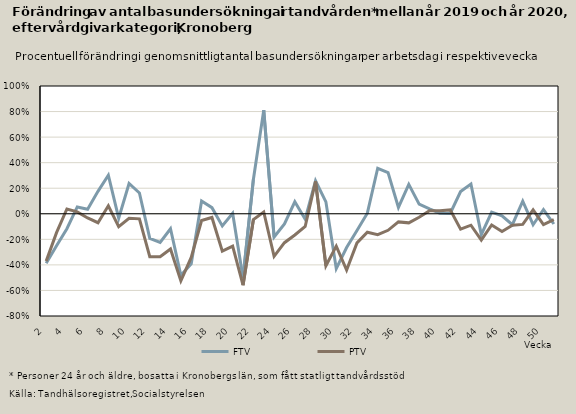
| Category | FTV | PTV |
|---|---|---|
| 2.0 | -0.387 | -0.37 |
| 3.0 | -0.25 | -0.148 |
| 4.0 | -0.117 | 0.037 |
| 5.0 | 0.054 | 0.015 |
| 6.0 | 0.035 | -0.033 |
| 7.0 | 0.175 | -0.07 |
| 8.0 | 0.302 | 0.062 |
| 9.0 | -0.034 | -0.101 |
| 10.0 | 0.237 | -0.035 |
| 11.0 | 0.163 | -0.04 |
| 12.0 | -0.192 | -0.336 |
| 13.0 | -0.225 | -0.336 |
| 14.0 | -0.117 | -0.276 |
| 15.0 | -0.482 | -0.525 |
| 16.0 | -0.392 | -0.342 |
| 17.0 | 0.1 | -0.053 |
| 18.0 | 0.048 | -0.029 |
| 19.0 | -0.095 | -0.293 |
| 20.0 | 0.005 | -0.253 |
| 21.0 | -0.502 | -0.559 |
| 22.0 | 0.269 | -0.046 |
| 23.0 | 0.811 | 0.014 |
| 24.0 | -0.182 | -0.333 |
| 25.0 | -0.08 | -0.226 |
| 26.0 | 0.094 | -0.166 |
| 27.0 | -0.042 | -0.1 |
| 28.0 | 0.258 | 0.254 |
| 29.0 | 0.093 | -0.407 |
| 30.0 | -0.43 | -0.253 |
| 31.0 | -0.264 | -0.441 |
| 32.0 | -0.131 | -0.228 |
| 33.0 | 0.005 | -0.144 |
| 34.0 | 0.356 | -0.164 |
| 35.0 | 0.322 | -0.129 |
| 36.0 | 0.05 | -0.063 |
| 37.0 | 0.23 | -0.071 |
| 38.0 | 0.076 | -0.027 |
| 39.0 | 0.038 | 0.024 |
| 40.0 | 0.005 | 0.024 |
| 41.0 | 0.002 | 0.03 |
| 42.0 | 0.174 | -0.12 |
| 43.0 | 0.233 | -0.089 |
| 44.0 | -0.163 | -0.206 |
| 45.0 | 0.013 | -0.087 |
| 46.0 | -0.015 | -0.138 |
| 47.0 | -0.086 | -0.09 |
| 48.0 | 0.098 | -0.083 |
| 49.0 | -0.086 | 0.03 |
| 50.0 | 0.033 | -0.085 |
| 51.0 | -0.08 | -0.046 |